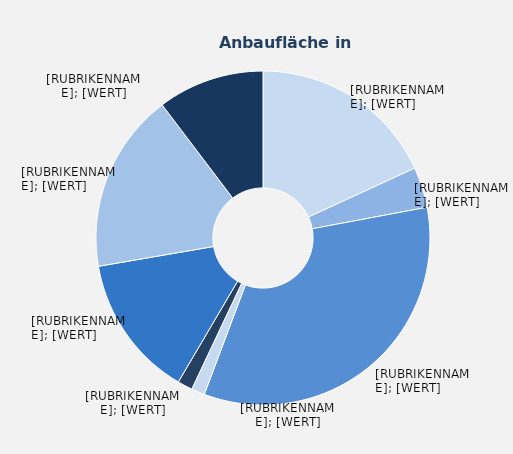
| Category | Series 1 |
|---|---|
| Feldsalat | 6.15 |
| Kopfsalat | 1.33 |
| sonstige Salate | 11.42 |
| Paprika | 0.44 |
| Radies | 0.49 |
| Salatgurken | 4.69 |
| Tomaten | 5.9 |
| sonstige Gemüsearten | 3.5 |